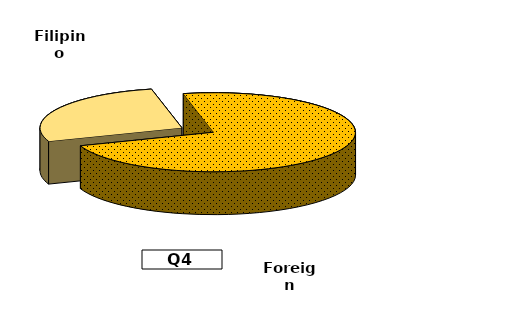
| Category | Series 0 |
|---|---|
| Filipino | 61.696 |
| Foreign | 165.825 |